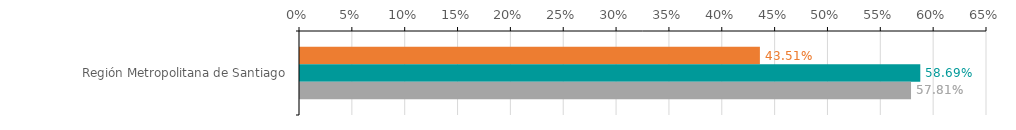
| Category | Numero de operaciones | Monto ($ MM) | Garantia ($ MM) |
|---|---|---|---|
| Región Metropolitana de Santiago | 0.435 | 0.587 | 0.578 |